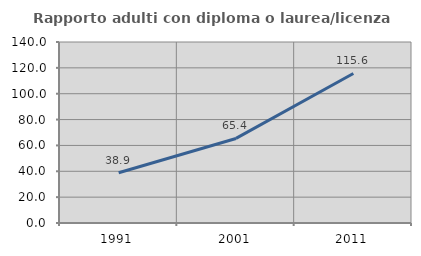
| Category | Rapporto adulti con diploma o laurea/licenza media  |
|---|---|
| 1991.0 | 38.88 |
| 2001.0 | 65.408 |
| 2011.0 | 115.641 |